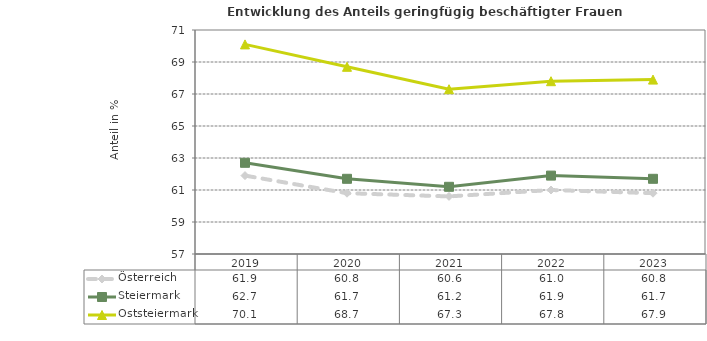
| Category | Österreich | Steiermark | Oststeiermark |
|---|---|---|---|
| 2023.0 | 60.8 | 61.7 | 67.9 |
| 2022.0 | 61 | 61.9 | 67.8 |
| 2021.0 | 60.6 | 61.2 | 67.3 |
| 2020.0 | 60.8 | 61.7 | 68.7 |
| 2019.0 | 61.9 | 62.7 | 70.1 |